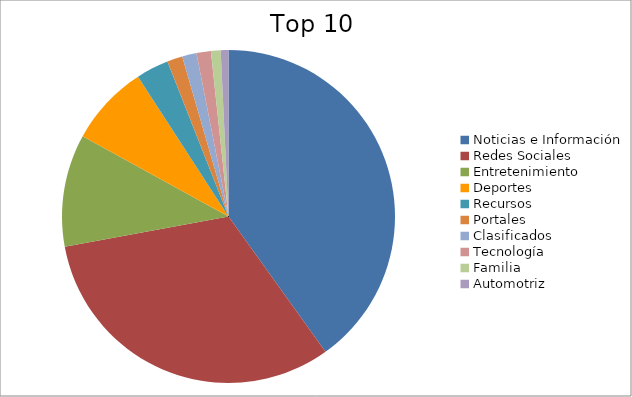
| Category | Series 0 |
|---|---|
| Noticias e Información | 38.98 |
| Redes Sociales | 31.1 |
| Entretenimiento | 10.61 |
| Deportes | 7.62 |
| Recursos | 3.08 |
| Portales | 1.45 |
| Clasificados | 1.36 |
| Tecnología | 1.36 |
| Familia | 0.91 |
| Automotriz | 0.73 |